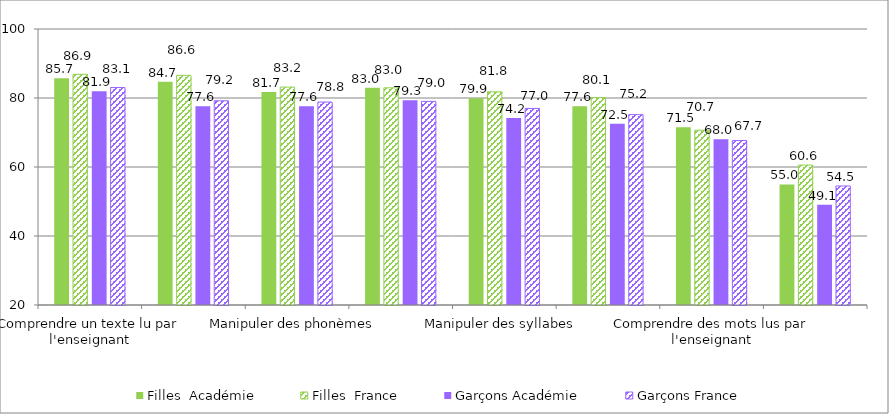
| Category | Filles  | Garçons |
|---|---|---|
| Comprendre un texte lu par l'enseignant | 86.87 | 83.05 |
| Comprendre des phrases lues par l'enseignant | 86.57 | 79.19 |
| Manipuler des phonèmes  | 83.17 | 78.83 |
| Comparer des suites de lettres | 82.95 | 79.02 |
| Manipuler des syllabes  | 81.79 | 76.97 |
| Connaitre le nom des lettres et le son qu’elles produisent | 80.11 | 75.18 |
| Comprendre des mots lus par l'enseignant | 70.67 | 67.66 |
| Reconnaitre des lettres  | 60.56 | 54.5 |